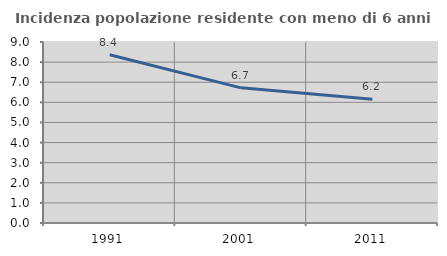
| Category | Incidenza popolazione residente con meno di 6 anni |
|---|---|
| 1991.0 | 8.367 |
| 2001.0 | 6.72 |
| 2011.0 | 6.151 |